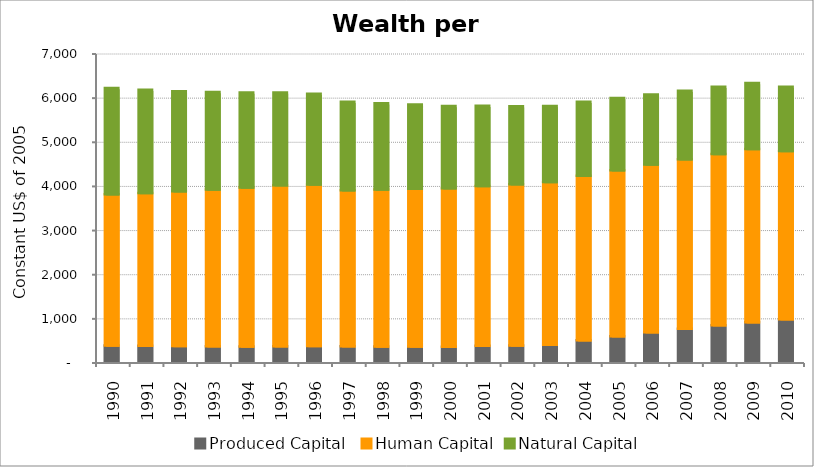
| Category | Produced Capital  | Human Capital | Natural Capital |
|---|---|---|---|
| 1990.0 | 368.886 | 3424.033 | 2410.012 |
| 1991.0 | 361.2 | 3464.428 | 2336.544 |
| 1992.0 | 356.153 | 3506.257 | 2264.226 |
| 1993.0 | 353.237 | 3550.531 | 2207.513 |
| 1994.0 | 348.272 | 3597.826 | 2154.845 |
| 1995.0 | 351.854 | 3645.814 | 2103.613 |
| 1996.0 | 355.064 | 3661.644 | 2053.518 |
| 1997.0 | 351.329 | 3532.81 | 2004.911 |
| 1998.0 | 346.845 | 3553.8 | 1956.241 |
| 1999.0 | 342.769 | 3574.293 | 1909.122 |
| 2000.0 | 338.63 | 3593.672 | 1862.322 |
| 2001.0 | 363.256 | 3620.479 | 1817.187 |
| 2002.0 | 368.711 | 3654.863 | 1763.163 |
| 2003.0 | 384.907 | 3689.216 | 1717.979 |
| 2004.0 | 487.454 | 3725.202 | 1674.866 |
| 2005.0 | 576.802 | 3762.658 | 1635.122 |
| 2006.0 | 667.012 | 3799.29 | 1588.839 |
| 2007.0 | 748.385 | 3839.438 | 1550.322 |
| 2008.0 | 826.708 | 3881.926 | 1521.871 |
| 2009.0 | 895.527 | 3925.768 | 1493.275 |
| 2010.0 | 960.186 | 3812.356 | 1459.749 |